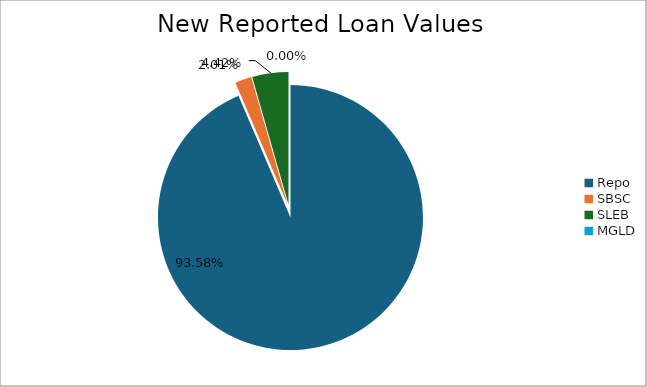
| Category | Series 0 |
|---|---|
| Repo | 10756950.465 |
| SBSC | 230565.447 |
| SLEB | 507666.125 |
| MGLD | 129.536 |